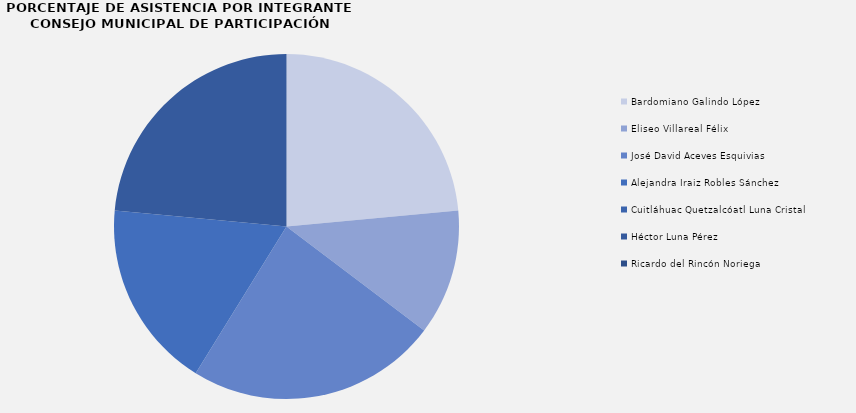
| Category | Series 0 |
|---|---|
| Bardomiano Galindo López | 4 |
| Eliseo Villareal Félix | 2 |
| José David Aceves Esquivias | 4 |
| Alejandra Iraiz Robles Sánchez | 3 |
| Cuitláhuac Quetzalcóatl Luna Cristal | 0 |
| Héctor Luna Pérez | 4 |
| Ricardo del Rincón Noriega | 0 |